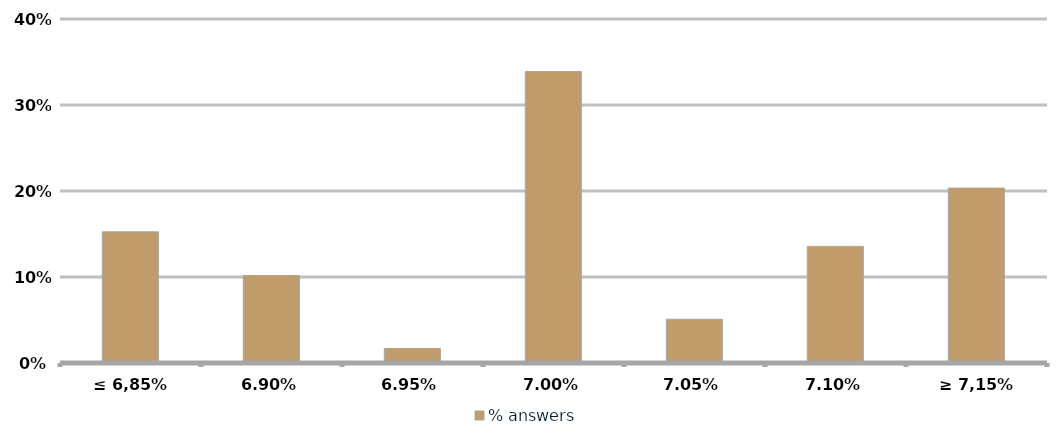
| Category | % answers |
|---|---|
| ≤ 6,85% | 0.153 |
| 6,90% | 0.102 |
| 6,95% | 0.017 |
| 7,00% | 0.339 |
| 7,05% | 0.051 |
| 7,10% | 0.136 |
| ≥ 7,15% | 0.203 |